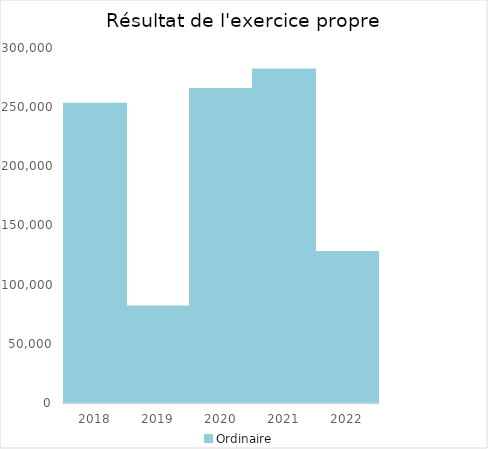
| Category |   | Ordinaire |    |
|---|---|---|---|
| 2018.0 |  | 252888.04 |  |
| 2019.0 |  | 81469.14 |  |
| 2020.0 |  | 265266.69 |  |
| 2021.0 |  | 281800.44 |  |
| 2022.0 |  | 127530.74 |  |